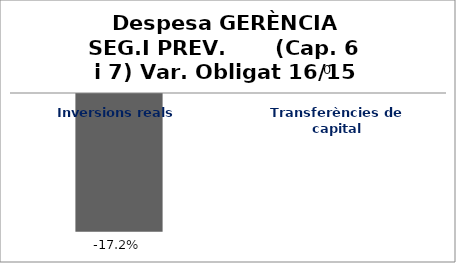
| Category | Series 0 |
|---|---|
| Inversions reals | -0.172 |
| Transferències de capital | 0 |